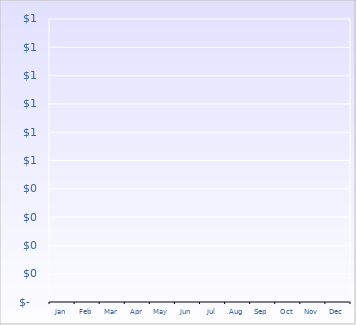
| Category | Expense |
|---|---|
| Jan | 0 |
| Feb | 0 |
| Mar | 0 |
| Apr | 0 |
| May | 0 |
| Jun | 0 |
| Jul | 0 |
| Aug | 0 |
| Sep | 0 |
| Oct | 0 |
| Nov | 0 |
| Dec | 0 |